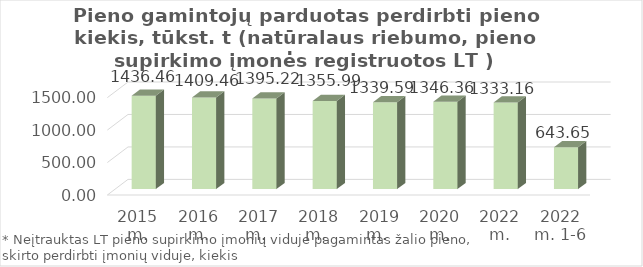
| Category | Lietuvos pieno supirkimo įmonėms* |
|---|---|
| 2015 m. | 1436.455 |
| 2016 m. | 1409.46 |
| 2017 m.  | 1395.224 |
| 2018 m.  | 1355.989 |
| 2019 m.  | 1339.59 |
| 2020 m. | 1346.36 |
| 2022 m. | 1333.16 |
| 2022 m. 1-6 mėn. | 643.652 |